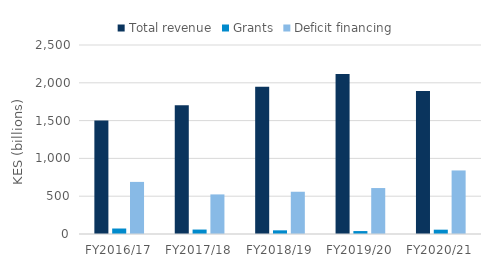
| Category | Total revenue | Grants | Deficit financing |
|---|---|---|---|
| FY2016/17 | 1500.61 | 72.6 | 689.1 |
| FY2017/18 | 1704.5 | 58.8 | 523.7 |
| FY2018/19 | 1949.2 | 48.5 | 558.9 |
| FY2019/20 | 2115.9 | 38.8 | 607.8 |
| FY2020/21 | 1892.6 | 57.2 | 840.6 |